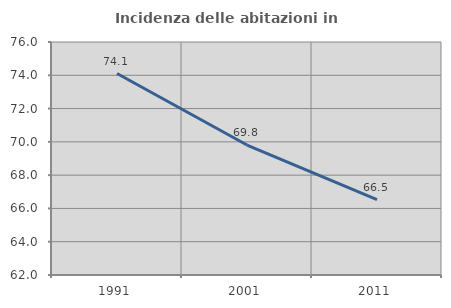
| Category | Incidenza delle abitazioni in proprietà  |
|---|---|
| 1991.0 | 74.107 |
| 2001.0 | 69.808 |
| 2011.0 | 66.534 |